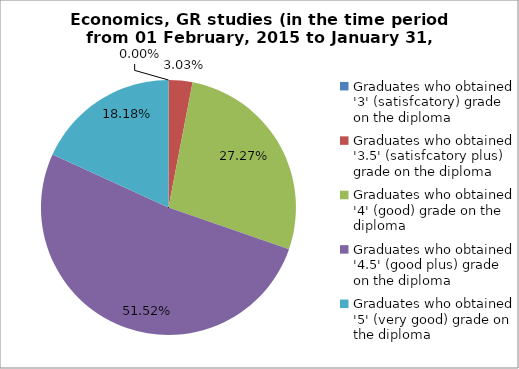
| Category | Series 0 |
|---|---|
| Graduates who obtained '3' (satisfcatory) grade on the diploma  | 0 |
| Graduates who obtained '3.5' (satisfcatory plus) grade on the diploma  | 3.03 |
| Graduates who obtained '4' (good) grade on the diploma  | 27.273 |
| Graduates who obtained '4.5' (good plus) grade on the diploma  | 51.515 |
| Graduates who obtained '5' (very good) grade on the diploma  | 18.182 |